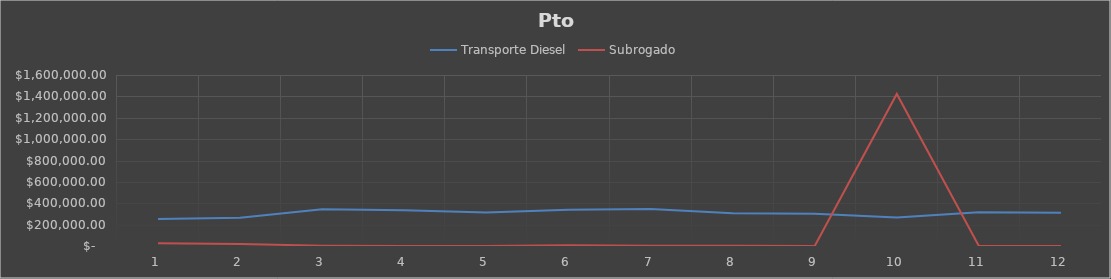
| Category | Transporte Diesel | Subrogado |
|---|---|---|
| 0 | 253571.25 | 25854 |
| 1 | 264086.25 | 19800 |
| 2 | 342967.5 | 2050 |
| 3 | 334113.75 | 0 |
| 4 | 312697.5 | 0 |
| 5 | 338887.5 | 6938 |
| 6 | 345900 | 2205 |
| 7 | 306153.75 | 2594 |
| 8 | 301676.25 | 0 |
| 9 | 267078.75 | 1423034 |
| 10 | 314805 | 0 |
| 11 | 312247.5 | 0 |